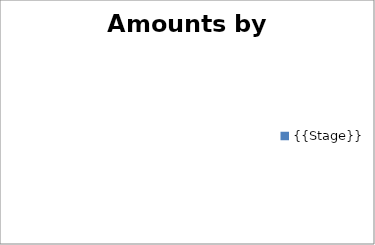
| Category | Amounts by Stage |
|---|---|
| {{Stage}} | 0 |